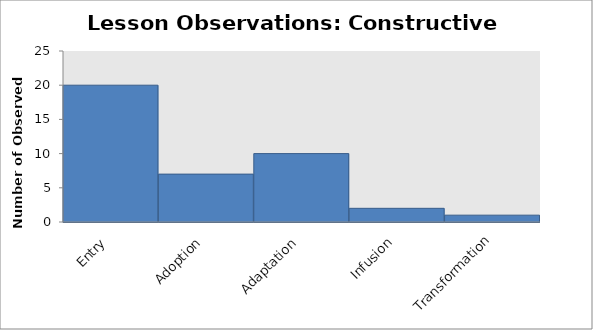
| Category | Lessons |
|---|---|
| Entry | 20 |
| Adoption | 7 |
| Adaptation | 10 |
| Infusion | 2 |
| Transformation | 1 |